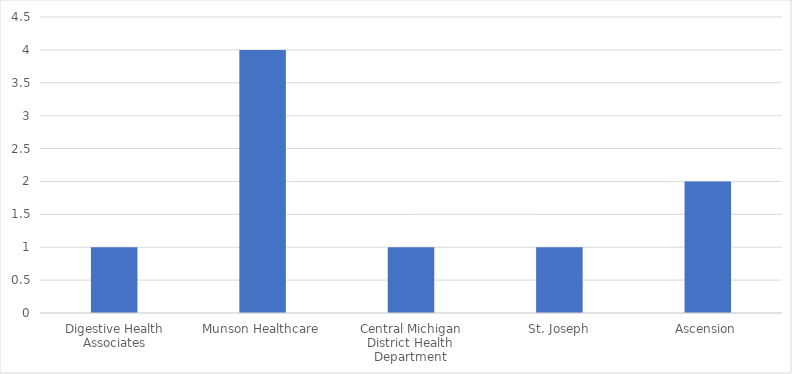
| Category | Number of Responses |
|---|---|
| Digestive Health Associates | 1 |
| Munson Healthcare | 4 |
| Central Michigan District Health Department | 1 |
| St. Joseph | 1 |
| Ascension | 2 |